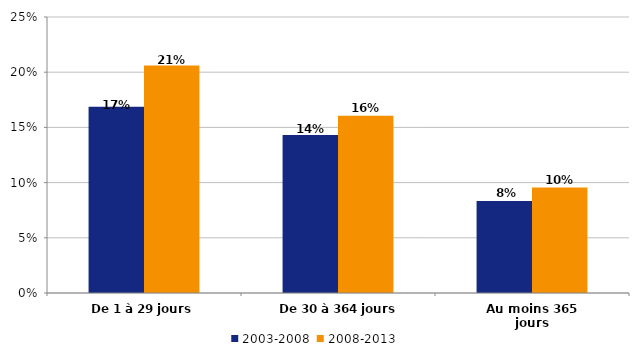
| Category | 2003-2008 | 2008-2013 |
|---|---|---|
| De 1 à 29 jours | 0.169 | 0.206 |
| De 30 à 364 jours | 0.143 | 0.161 |
| Au moins 365 jours | 0.083 | 0.095 |